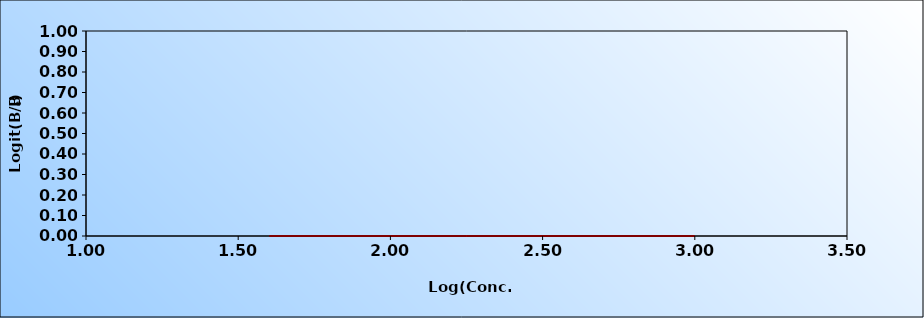
| Category | Series 0 |
|---|---|
| 1.6020599913279623 | 0 |
| 2.0 | 0 |
| 2.4771212547196626 | 0 |
| 3.0 | 0 |